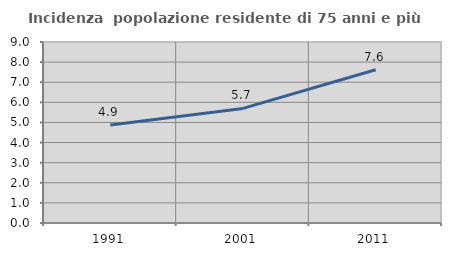
| Category | Incidenza  popolazione residente di 75 anni e più |
|---|---|
| 1991.0 | 4.87 |
| 2001.0 | 5.697 |
| 2011.0 | 7.622 |